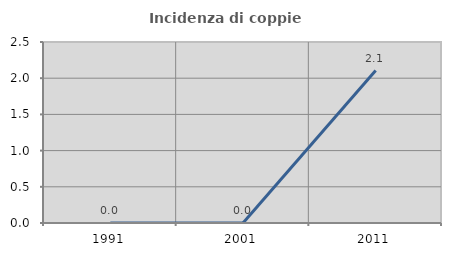
| Category | Incidenza di coppie miste |
|---|---|
| 1991.0 | 0 |
| 2001.0 | 0 |
| 2011.0 | 2.105 |